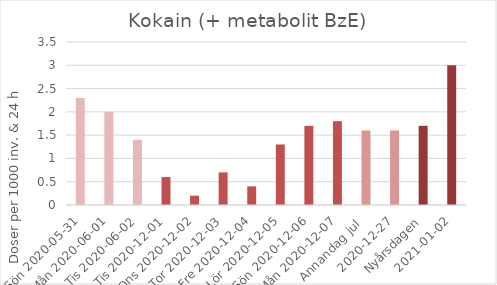
| Category | Kokain (+ metabolit BzE) |
|---|---|
| Sön 2020-05-31 | 2.3 |
| Mån 2020-06-01 | 2 |
|  Tis 2020-06-02 | 1.4 |
| Tis 2020-12-01 | 0.6 |
| Ons 2020-12-02 | 0.2 |
| Tor 2020-12-03 | 0.7 |
| Fre 2020-12-04 | 0.4 |
| Lör 2020-12-05 | 1.3 |
| Sön 2020-12-06 | 1.7 |
| Mån 2020-12-07 | 1.8 |
| Annandag jul  | 1.6 |
| 2020-12-27 | 1.6 |
| Nyårsdagen | 1.7 |
| 2021-01-02 | 3 |